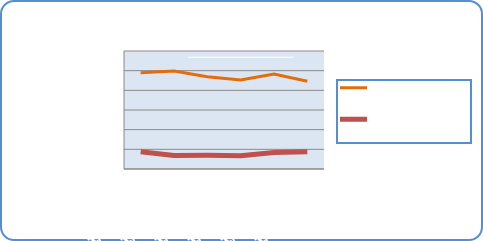
| Category | Motorin Türleri  | Benzin Türleri |
|---|---|---|
| 1/15/18 | 48925422.798 | 8809203.124 |
| 1/16/18 | 49867484.465 | 6891069.879 |
| 1/17/18 | 46931252.586 | 6964105.354 |
| 1/18/18 | 45272601.004 | 6800781.231 |
| 1/19/18 | 48261844.046 | 8328016.43 |
| 1/20/18 | 44645420.602 | 8772024.283 |